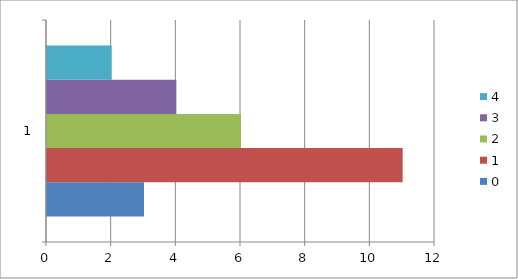
| Category | 0 | 1 | 2 | 3 | 4 |
|---|---|---|---|---|---|
| 0 | 3 | 11 | 6 | 4 | 2 |